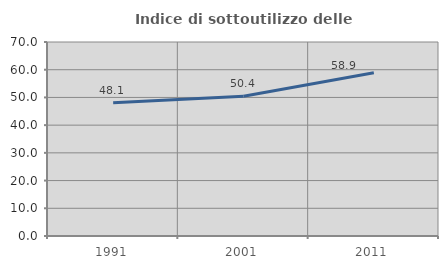
| Category | Indice di sottoutilizzo delle abitazioni  |
|---|---|
| 1991.0 | 48.066 |
| 2001.0 | 50.399 |
| 2011.0 | 58.889 |